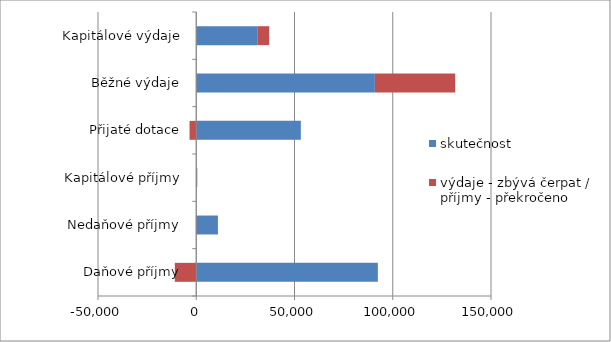
| Category | skutečnost | výdaje - zbývá čerpat / příjmy - překročeno |
|---|---|---|
| Daňové příjmy | 92419.947 | -10915.147 |
| Nedaňové příjmy | 11040.667 | -204.367 |
| Kapitálové příjmy | 536.52 | -64.12 |
| Přijaté dotace | 53223.579 | -3424.079 |
| Běžné výdaje | 90899.537 | 40878.163 |
| Kapitálové výdaje | 31060.326 | 6062.774 |